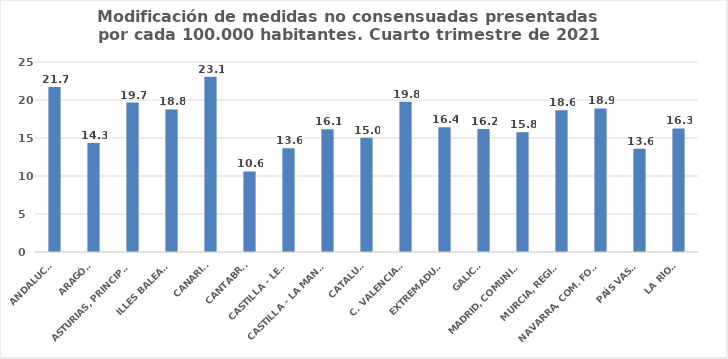
| Category | Series 0 |
|---|---|
| ANDALUCÍA | 21.696 |
| ARAGÓN | 14.326 |
| ASTURIAS, PRINCIPADO | 19.668 |
| ILLES BALEARS | 18.755 |
| CANARIAS | 23.056 |
| CANTABRIA | 10.607 |
| CASTILLA - LEÓN | 13.637 |
| CASTILLA - LA MANCHA | 16.15 |
| CATALUÑA | 15.019 |
| C. VALENCIANA | 19.77 |
| EXTREMADURA | 16.423 |
| GALICIA | 16.174 |
| MADRID, COMUNIDAD | 15.76 |
| MURCIA, REGIÓN | 18.637 |
| NAVARRA, COM. FORAL | 18.895 |
| PAÍS VASCO | 13.595 |
| LA RIOJA | 16.26 |